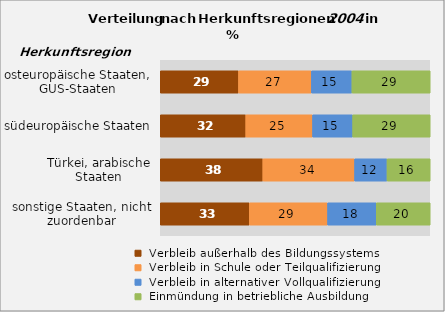
| Category |  Verbleib außerhalb des Bildungssystems |  Verbleib in Schule oder Teilqualifizierung |  Verbleib in alternativer Vollqualifizierung |  Einmündung in betriebliche Ausbildung |
|---|---|---|---|---|
| sonstige Staaten, nicht zuordenbar | 33 | 29 | 18 | 20 |
| Türkei, arabische Staaten | 38 | 34 | 12 | 16 |
| südeuropäische Staaten | 32 | 25 | 15 | 29 |
| osteuropäische Staaten, GUS-Staaten | 29 | 27 | 15 | 29 |